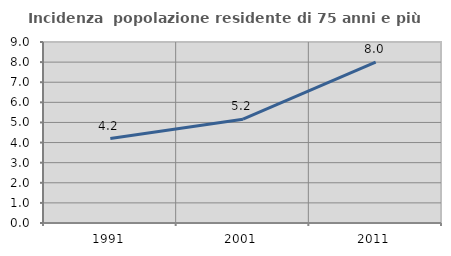
| Category | Incidenza  popolazione residente di 75 anni e più |
|---|---|
| 1991.0 | 4.2 |
| 2001.0 | 5.159 |
| 2011.0 | 8.005 |